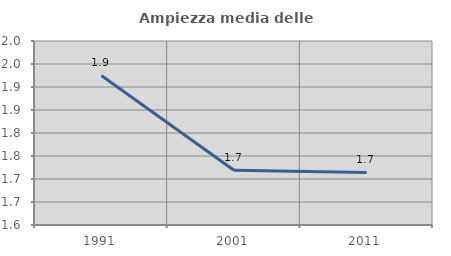
| Category | Ampiezza media delle famiglie |
|---|---|
| 1991.0 | 1.925 |
| 2001.0 | 1.719 |
| 2011.0 | 1.714 |